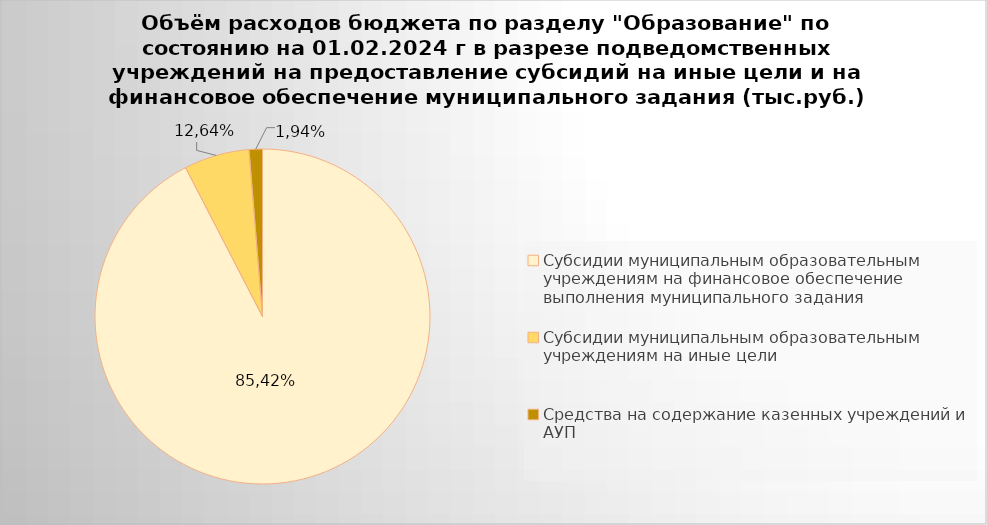
| Category | Series 0 |
|---|---|
| Субсидии муниципальным образовательным учреждениям на финансовое обеспечение выполнения муниципального задания | 8988667.3 |
| Субсидии муниципальным образовательным учреждениям на иные цели | 613375.6 |
| Средства на содержание казенных учреждений и АУП | 125055 |